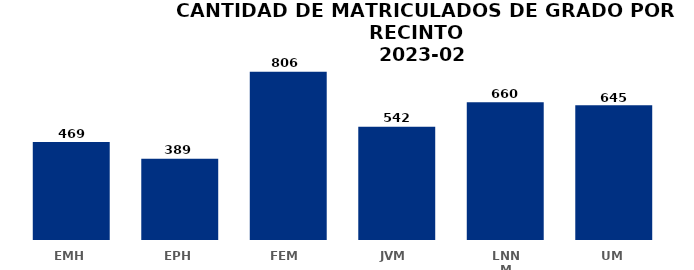
| Category | Series 0 |
|---|---|
| EMH | 469 |
| EPH | 389 |
| FEM  | 806 |
| JVM  | 542 |
| LNNM | 660 |
| UM | 645 |